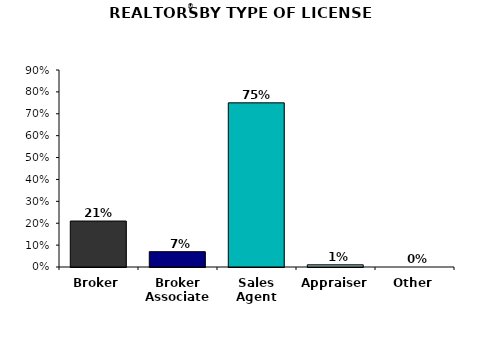
| Category | Series 0 |
|---|---|
| Broker | 21 |
| Broker Associate | 7 |
| Sales Agent | 75 |
| Appraiser | 1 |
| Other | 0 |